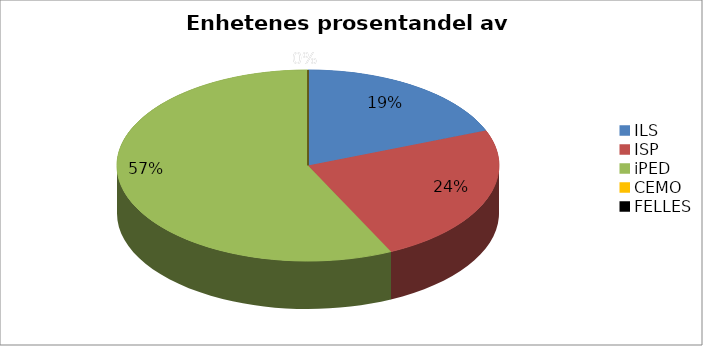
| Category | Series 0 |
|---|---|
| ILS | 661333.333 |
| ISP | 826666.667 |
| iPED | 1984000 |
| CEMO | 0 |
| FELLES | 0 |